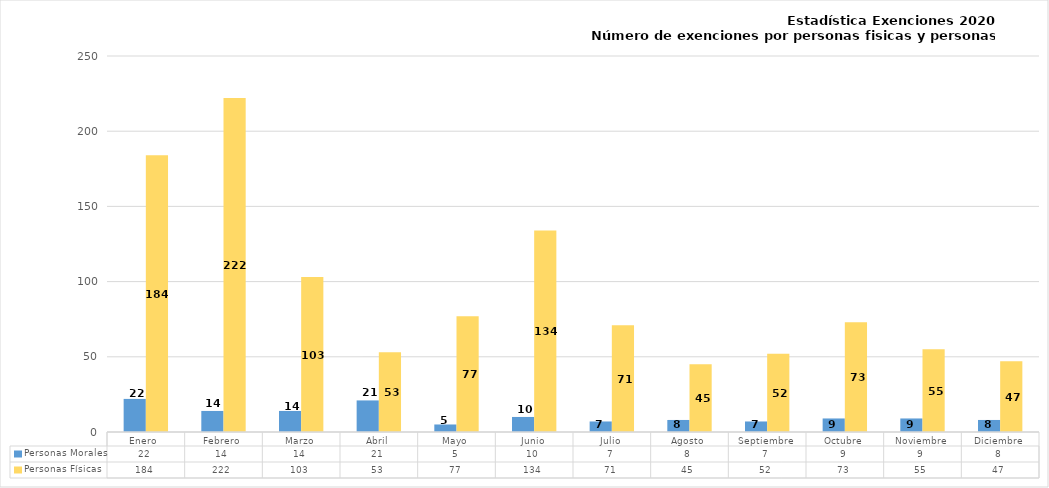
| Category | Personas Morales | Personas Físicas |
|---|---|---|
| Enero  | 22 | 184 |
| Febrero | 14 | 222 |
| Marzo | 14 | 103 |
| Abril | 21 | 53 |
| Mayo | 5 | 77 |
| Junio | 10 | 134 |
| Julio | 7 | 71 |
| Agosto | 8 | 45 |
| Septiembre | 7 | 52 |
| Octubre | 9 | 73 |
| Noviembre | 9 | 55 |
| Diciembre | 8 | 47 |